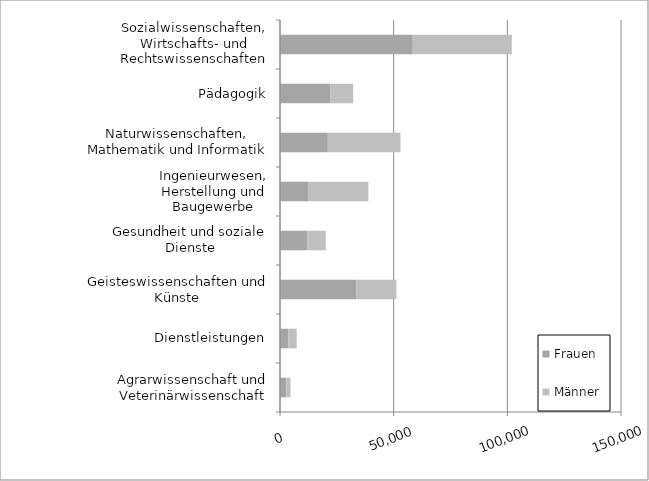
| Category | Frauen | Männer |
|---|---|---|
| Agrarwissenschaft und Veterinärwissenschaft | 2777 | 1831 |
| Dienstleistungen | 3696 | 3651 |
| Geisteswissenschaften und Künste | 33645 | 17553 |
| Gesundheit und soziale Dienste | 12069 | 8060 |
| Ingenieurwesen, Herstellung und Baugewerbe | 12592 | 26276 |
| Naturwissenschaften, Mathematik und Informatik | 21052 | 31944 |
| Pädagogik | 22125 | 10041 |
| Sozialwissenschaften, Wirtschafts- und Rechtswissenschaften | 58389 | 43560 |